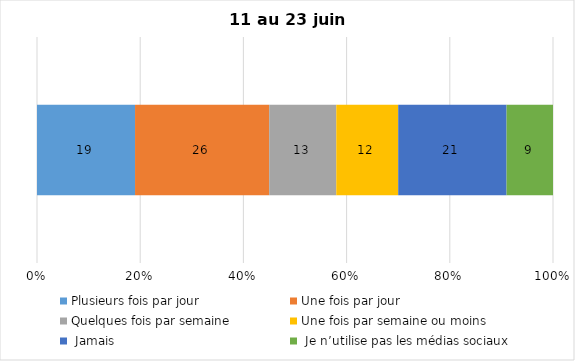
| Category | Plusieurs fois par jour | Une fois par jour | Quelques fois par semaine   | Une fois par semaine ou moins   |  Jamais   |  Je n’utilise pas les médias sociaux |
|---|---|---|---|---|---|---|
| 0 | 19 | 26 | 13 | 12 | 21 | 9 |